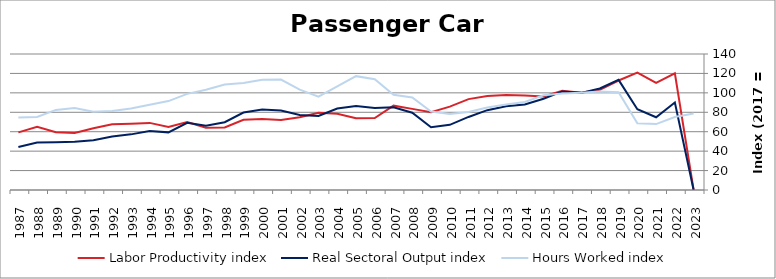
| Category | Labor Productivity index | Real Sectoral Output index | Hours Worked index |
|---|---|---|---|
| 2023.0 | 0 | 0 | 78.639 |
| 2022.0 | 120.065 | 90.141 | 75.077 |
| 2021.0 | 110.317 | 74.845 | 67.845 |
| 2020.0 | 120.877 | 83.118 | 68.762 |
| 2019.0 | 112.702 | 113.377 | 100.599 |
| 2018.0 | 103.193 | 104.53 | 101.296 |
| 2017.0 | 100 | 100 | 100 |
| 2016.0 | 102.069 | 101.504 | 99.447 |
| 2015.0 | 96.333 | 93.978 | 97.555 |
| 2014.0 | 97.263 | 88.058 | 90.536 |
| 2013.0 | 97.749 | 86.136 | 88.12 |
| 2012.0 | 96.733 | 82.201 | 84.977 |
| 2011.0 | 93.544 | 75.2 | 80.39 |
| 2010.0 | 85.844 | 67.095 | 78.16 |
| 2009.0 | 79.955 | 64.558 | 80.743 |
| 2008.0 | 83.498 | 79.506 | 95.218 |
| 2007.0 | 86.824 | 85.188 | 98.115 |
| 2006.0 | 74.057 | 84.399 | 113.964 |
| 2005.0 | 73.834 | 86.532 | 117.199 |
| 2004.0 | 78.591 | 83.81 | 106.641 |
| 2003.0 | 79.409 | 76.253 | 96.026 |
| 2002.0 | 74.794 | 77.292 | 103.339 |
| 2001.0 | 72.087 | 81.906 | 113.621 |
| 2000.0 | 73.039 | 82.819 | 113.39 |
| 1999.0 | 72.335 | 79.716 | 110.203 |
| 1998.0 | 64.317 | 69.781 | 108.496 |
| 1997.0 | 64.175 | 66.194 | 103.145 |
| 1996.0 | 69.944 | 69.212 | 98.954 |
| 1995.0 | 64.799 | 59.327 | 91.555 |
| 1994.0 | 69.089 | 60.698 | 87.854 |
| 1993.0 | 68.249 | 57.276 | 83.922 |
| 1992.0 | 67.742 | 55.013 | 81.209 |
| 1991.0 | 63.562 | 51.267 | 80.656 |
| 1990.0 | 58.631 | 49.551 | 84.513 |
| 1989.0 | 59.563 | 49.103 | 82.439 |
| 1988.0 | 64.98 | 48.832 | 75.149 |
| 1987.0 | 59.334 | 44.289 | 74.643 |